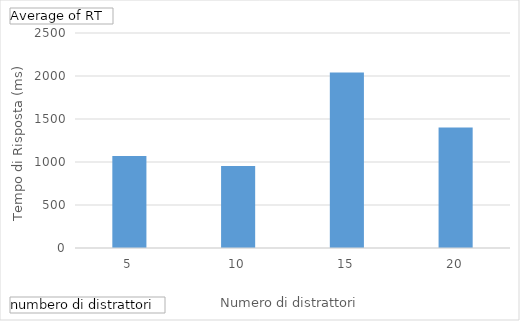
| Category | 1 |
|---|---|
| 5 | 1070.571 |
| 10 | 954.167 |
| 15 | 2041.2 |
| 20 | 1401.5 |